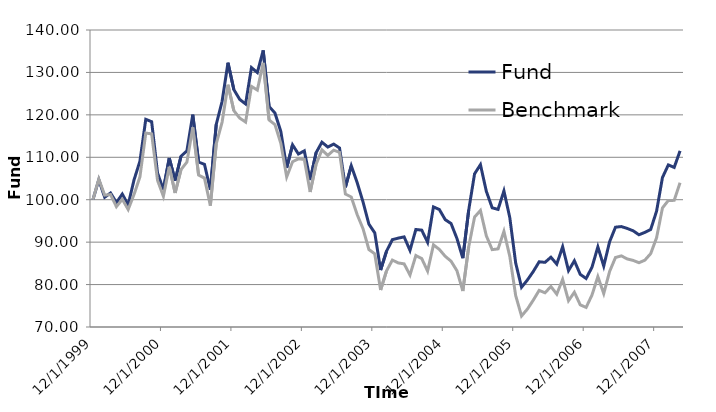
| Category | Fund | Benchmark |
|---|---|---|
| 12/31/99 | 100 | 100 |
| 1/31/00 | 104.702 | 104.884 |
| 2/29/00 | 100.576 | 101.083 |
| 3/31/00 | 101.583 | 101.215 |
| 4/30/00 | 99.325 | 98.366 |
| 5/31/00 | 101.329 | 100.107 |
| 6/30/00 | 98.794 | 97.688 |
| 7/31/00 | 104.672 | 101.251 |
| 8/31/00 | 109.065 | 105.344 |
| 9/30/00 | 118.946 | 115.706 |
| 10/31/00 | 118.386 | 115.515 |
| 11/30/00 | 106.32 | 104.579 |
| 12/31/00 | 102.389 | 100.812 |
| 1/31/01 | 109.835 | 107.767 |
| 2/28/01 | 104.496 | 101.592 |
| 3/31/01 | 110.249 | 107.097 |
| 4/30/01 | 111.484 | 108.844 |
| 5/31/01 | 120.05 | 117.038 |
| 6/30/01 | 108.88 | 105.792 |
| 7/31/01 | 108.348 | 105.1 |
| 8/31/01 | 102.346 | 98.608 |
| 9/30/01 | 117.739 | 113.167 |
| 10/31/01 | 123.186 | 118.302 |
| 11/30/01 | 132.295 | 127.106 |
| 12/31/01 | 125.957 | 120.993 |
| 1/31/02 | 123.635 | 119.231 |
| 2/28/02 | 122.569 | 118.305 |
| 3/31/02 | 131.139 | 126.705 |
| 4/30/02 | 129.973 | 125.841 |
| 5/31/02 | 135.182 | 132.272 |
| 6/30/02 | 121.99 | 118.816 |
| 7/31/02 | 120.441 | 117.707 |
| 8/31/02 | 116.084 | 113.288 |
| 9/30/02 | 107.511 | 105.352 |
| 10/31/02 | 112.929 | 108.951 |
| 11/30/02 | 110.772 | 109.625 |
| 12/31/02 | 111.511 | 109.506 |
| 1/31/03 | 104.633 | 101.826 |
| 2/28/03 | 111.055 | 108.342 |
| 3/31/03 | 113.555 | 111.758 |
| 4/30/03 | 112.424 | 110.448 |
| 5/31/03 | 113.115 | 111.687 |
| 6/30/03 | 112.199 | 111.171 |
| 7/31/03 | 102.941 | 101.319 |
| 8/31/03 | 108.015 | 100.64 |
| 9/30/03 | 104.065 | 96.526 |
| 10/31/03 | 99.49 | 93.18 |
| 11/30/03 | 94.235 | 88.259 |
| 12/31/03 | 92.192 | 87.23 |
| 1/31/04 | 83.422 | 78.726 |
| 2/29/04 | 87.861 | 83.21 |
| 3/31/04 | 90.585 | 85.775 |
| 4/30/04 | 90.947 | 85.094 |
| 5/31/04 | 91.243 | 84.887 |
| 6/30/04 | 88.058 | 82.253 |
| 7/31/04 | 92.984 | 86.843 |
| 8/31/04 | 92.829 | 86.133 |
| 9/30/04 | 89.977 | 83.18 |
| 10/31/04 | 98.306 | 89.358 |
| 11/30/04 | 97.693 | 88.286 |
| 12/31/04 | 95.304 | 86.661 |
| 1/31/05 | 94.381 | 85.506 |
| 2/28/05 | 90.851 | 83.253 |
| 3/31/05 | 86.217 | 78.484 |
| 4/30/05 | 97.538 | 88.898 |
| 5/31/05 | 106.099 | 95.908 |
| 6/30/05 | 108.261 | 97.465 |
| 7/31/05 | 101.997 | 91.499 |
| 8/31/05 | 98.094 | 88.235 |
| 9/30/05 | 97.718 | 88.414 |
| 10/31/05 | 102.074 | 92.532 |
| 11/30/05 | 95.786 | 86.643 |
| 12/31/05 | 85.106 | 77.424 |
| 1/31/06 | 79.366 | 72.588 |
| 2/28/06 | 81.086 | 74.229 |
| 3/31/06 | 83.078 | 76.321 |
| 4/30/06 | 85.37 | 78.631 |
| 5/31/06 | 85.24 | 78.062 |
| 6/30/06 | 86.449 | 79.541 |
| 7/31/06 | 84.823 | 77.747 |
| 8/31/06 | 88.904 | 81.221 |
| 9/30/06 | 83.295 | 76.199 |
| 10/31/06 | 85.607 | 78.189 |
| 11/30/06 | 82.402 | 75.215 |
| 12/31/06 | 81.434 | 74.616 |
| 1/31/07 | 84.092 | 77.535 |
| 2/28/07 | 88.882 | 81.874 |
| 3/31/07 | 84.359 | 77.885 |
| 4/30/07 | 90.098 | 83.088 |
| 5/31/07 | 93.523 | 86.377 |
| 6/30/07 | 93.673 | 86.762 |
| 7/31/07 | 93.227 | 86.045 |
| 8/31/07 | 92.679 | 85.698 |
| 9/30/07 | 91.738 | 85.154 |
| 10/31/07 | 92.302 | 85.742 |
| 11/30/07 | 93 | 87.298 |
| 12/31/07 | 97.306 | 91.038 |
| 1/31/08 | 105.222 | 98.06 |
| 2/29/08 | 108.205 | 99.829 |
| 3/31/08 | 107.611 | 99.847 |
| 4/30/08 | 111.513 | 104.007 |